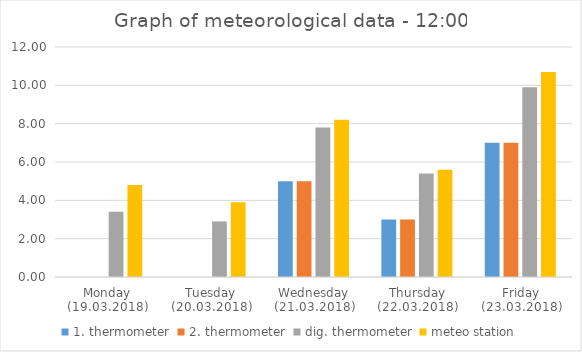
| Category | 1. thermometer | 2. thermometer | dig. thermometer | meteo station |
|---|---|---|---|---|
| Monday (19.03.2018) | 0 | 0 | 3.4 | 4.8 |
| Tuesday (20.03.2018) | 0 | 0 | 2.9 | 3.9 |
| Wednesday (21.03.2018) | 5 | 5 | 7.8 | 8.2 |
| Thursday (22.03.2018) | 3 | 3 | 5.4 | 5.6 |
| Friday (23.03.2018) | 7 | 7 | 9.9 | 10.7 |